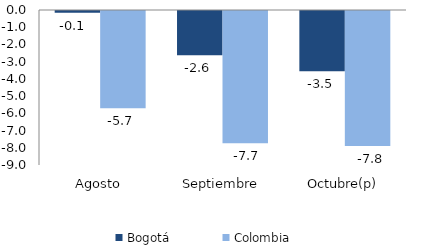
| Category | Bogotá | Colombia |
|---|---|---|
| Agosto | -0.101 | -5.652 |
| Septiembre | -2.565 | -7.673 |
| Octubre(p) | -3.5 | -7.84 |